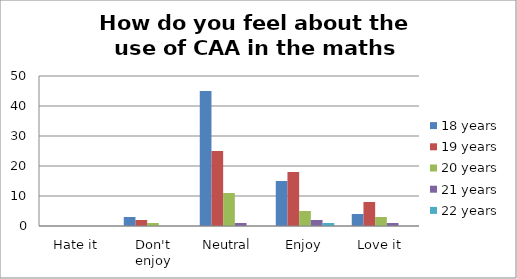
| Category | 18 years | 19 years | 20 years | 21 years | 22 years |
|---|---|---|---|---|---|
| Hate it | 0 | 0 | 0 | 0 | 0 |
| Don't enjoy | 3 | 2 | 1 | 0 | 0 |
| Neutral | 45 | 25 | 11 | 1 | 0 |
| Enjoy | 15 | 18 | 5 | 2 | 1 |
| Love it | 4 | 8 | 3 | 1 | 0 |